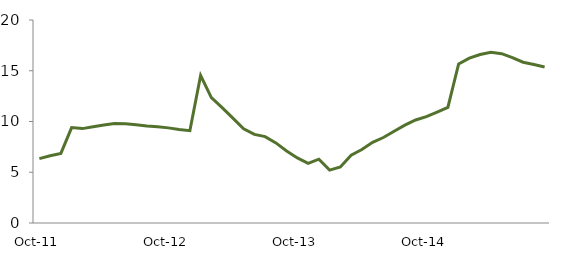
| Category | Series 0 |
|---|---|
| Oct-11 | 6.343 |
|  | 6.624 |
|  | 6.86 |
|  | 9.397 |
|  | 9.299 |
|  | 9.489 |
|  | 9.655 |
|  | 9.807 |
|  | 9.788 |
|  | 9.681 |
|  | 9.551 |
|  | 9.482 |
| Oct-12 | 9.372 |
|  | 9.217 |
|  | 9.093 |
|  | 14.528 |
|  | 12.349 |
|  | 11.373 |
|  | 10.337 |
|  | 9.286 |
|  | 8.73 |
|  | 8.508 |
|  | 7.893 |
|  | 7.089 |
| Oct-13 | 6.413 |
|  | 5.876 |
|  | 6.284 |
|  | 5.213 |
|  | 5.519 |
|  | 6.687 |
|  | 7.238 |
|  | 7.954 |
|  | 8.423 |
|  | 9.043 |
|  | 9.636 |
|  | 10.148 |
| Oct-14 | 10.484 |